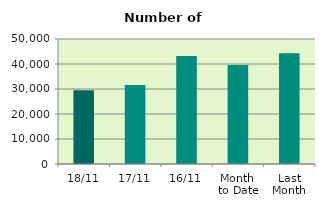
| Category | Series 0 |
|---|---|
| 18/11 | 29454 |
| 17/11 | 31562 |
| 16/11 | 43192 |
| Month 
to Date | 39628.714 |
| Last
Month | 44266.476 |